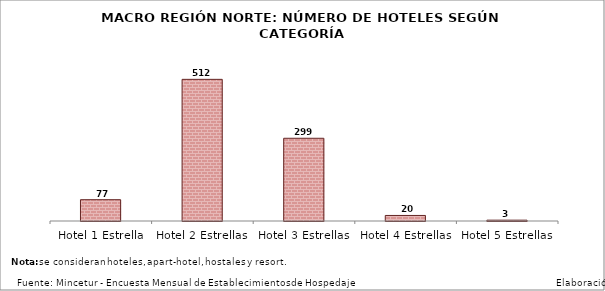
| Category | Series 0 |
|---|---|
| Hotel 1 Estrella | 77 |
| Hotel 2 Estrellas | 512 |
| Hotel 3 Estrellas | 299 |
| Hotel 4 Estrellas | 20 |
| Hotel 5 Estrellas | 3 |